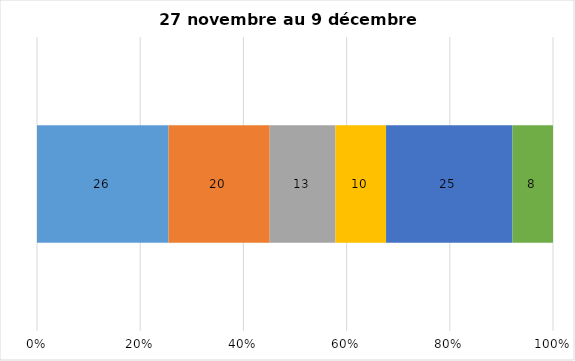
| Category | Plusieurs fois par jour | Une fois par jour | Quelques fois par semaine   | Une fois par semaine ou moins   |  Jamais   |  Je n’utilise pas les médias sociaux |
|---|---|---|---|---|---|---|
| 0 | 26 | 20 | 13 | 10 | 25 | 8 |